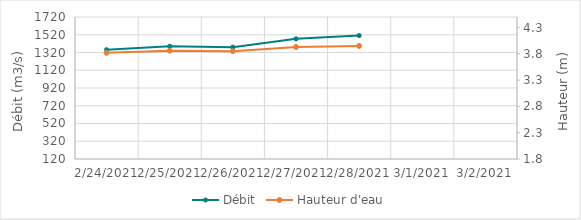
| Category | Débit |
|---|---|
| 2/2/21 | 1661.57 |
| 2/1/21 | 1486.51 |
| 1/31/21 | 1485.73 |
| 1/30/21 | 1435.89 |
| 1/29/21 | 1342.03 |
| 1/28/21 | 1308.86 |
| 1/27/21 | 1285.44 |